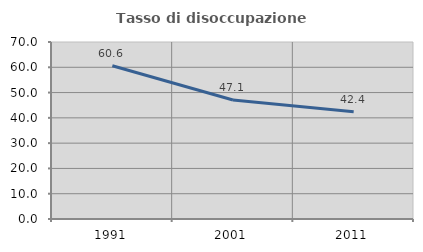
| Category | Tasso di disoccupazione giovanile  |
|---|---|
| 1991.0 | 60.584 |
| 2001.0 | 47.059 |
| 2011.0 | 42.373 |